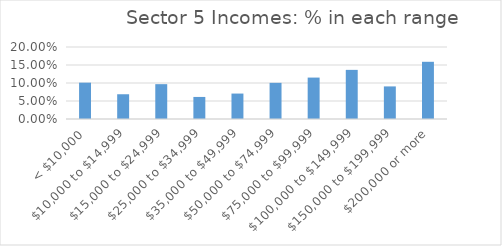
| Category | Series 0 |
|---|---|
| < $10,000 | 0.101 |
| $10,000 to $14,999 | 0.069 |
| $15,000 to $24,999 | 0.097 |
| $25,000 to $34,999 | 0.061 |
| $35,000 to $49,999 | 0.071 |
| $50,000 to $74,999 | 0.1 |
| $75,000 to $99,999 | 0.115 |
| $100,000 to $149,999 | 0.136 |
| $150,000 to $199,999 | 0.091 |
| $200,000 or more | 0.159 |